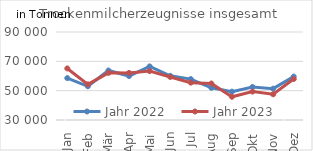
| Category | Jahr 2022 | Jahr 2023 |
|---|---|---|
| Jan | 58575.881 | 65152.354 |
| Feb | 52986.291 | 54300.555 |
| Mär | 63762.244 | 62137.502 |
| Apr | 59968.313 | 62097.589 |
| Mai | 66542.953 | 63341.384 |
| Jun | 60122.961 | 59354.015 |
| Jul | 57893.834 | 55471.361 |
| Aug | 51950.084 | 54882.112 |
| Sep | 49324.119 | 45836.301 |
| Okt | 52536.603 | 49401.134 |
| Nov | 51373.127 | 47544.814 |
| Dez | 59602.333 | 57953.006 |